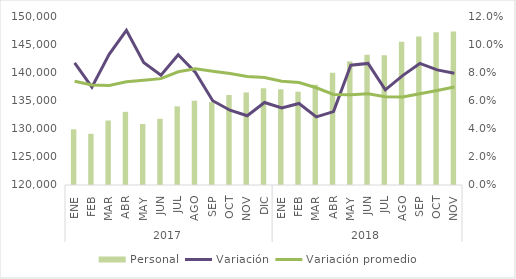
| Category | Personal |
|---|---|
| 0 | 129884 |
| 1 | 129089 |
| 2 | 131446 |
| 3 | 132988 |
| 4 | 130826 |
| 5 | 131766 |
| 6 | 133961 |
| 7 | 134956 |
| 8 | 134721 |
| 9 | 135984 |
| 10 | 136428 |
| 11 | 137174 |
| 12 | 136983 |
| 13 | 136560 |
| 14 | 137803 |
| 15 | 139922 |
| 16 | 141949 |
| 17 | 143138 |
| 18 | 143016 |
| 19 | 145441 |
| 20 | 146351 |
| 21 | 147100 |
| 22 | 147245 |